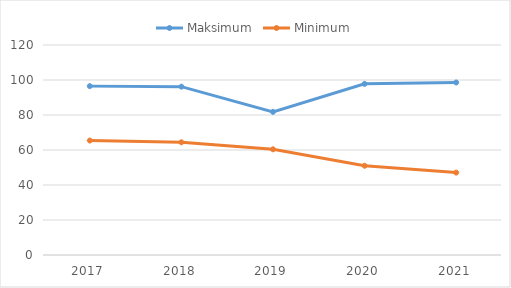
| Category | Maksimum | Minimum |
|---|---|---|
| 2017.0 | 96.5 | 65.4 |
| 2018.0 | 96.2 | 64.4 |
| 2019.0 | 81.8 | 60.4 |
| 2020.0 | 97.8 | 51 |
| 2021.0 | 98.583 | 47.083 |